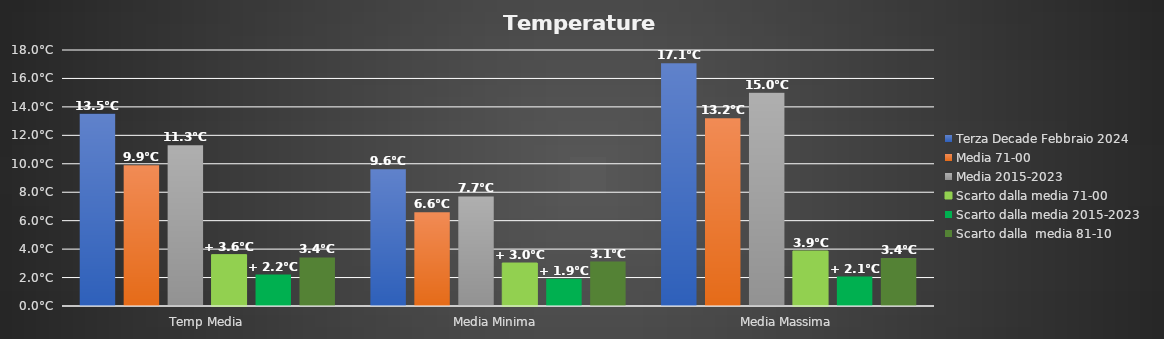
| Category | Terza Decade Febbraio 2024 | Media 71-00 | Media 2015-2023 | Scarto dalla media 71-00 | Scarto dalla media 2015-2023 | Scarto dalla  media 81-10 |
|---|---|---|---|---|---|---|
| Temp Media | 13.512 | 9.9 | 11.3 | 3.612 | 2.212 | 3.412 |
| Media Minima  | 9.622 | 6.6 | 7.7 | 3.022 | 1.922 | 3.122 |
| Media Massima | 17.067 | 13.2 | 15 | 3.867 | 2.067 | 3.367 |